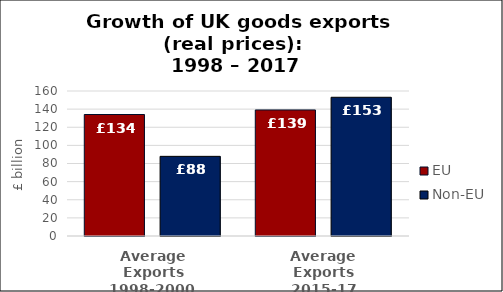
| Category | EU | Non-EU |
|---|---|---|
| Average Exports 1998-2000  | 134.062 | 87.883 |
| Average Exports 2015-17 | 139.085 | 153.073 |